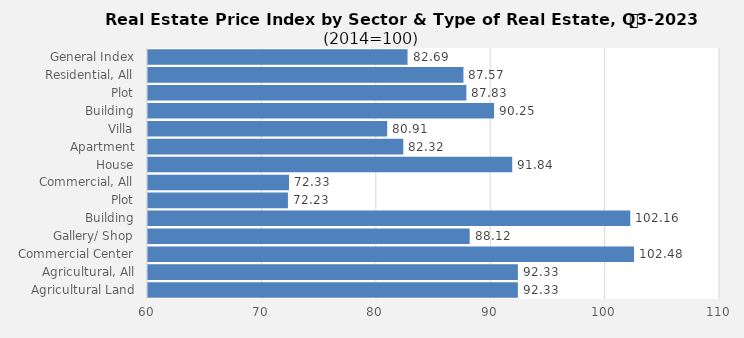
| Category | 2023 |
|---|---|
| General Index | 82.687 |
| Residential, All | 87.574 |
| Plot | 87.829 |
| Building | 90.25 |
| Villa | 80.909 |
| Apartment | 82.317 |
| House | 91.837 |
| Commercial, All | 72.328 |
| Plot | 72.232 |
| Building | 102.156 |
| Gallery/ Shop | 88.119 |
| Commercial Center | 102.482 |
| Agricultural, All | 92.332 |
| Agricultural Land | 92.332 |